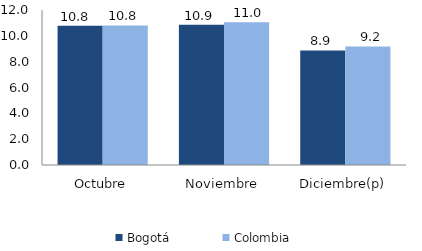
| Category | Bogotá | Colombia |
|---|---|---|
| Octubre | 10.782 | 10.804 |
| Noviembre | 10.861 | 11.044 |
| Diciembre(p) | 8.872 | 9.177 |